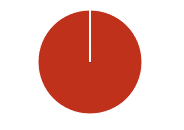
| Category | Total |
|---|---|
| Y | 0 |
| R | 0 |
| T | 0 |
| M | 0 |
| F | 0 |
| N | 150 |